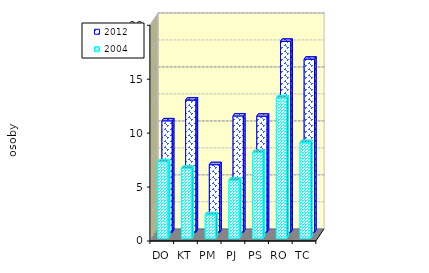
| Category | 2012 | 2004 |
|---|---|---|
| DO | 10.319 | 7.089 |
| KT | 12.243 | 6.489 |
| PM | 6.256 | 2.178 |
| PJ | 10.773 | 5.388 |
| PS | 10.747 | 7.948 |
| RO | 17.689 | 13.023 |
| TC | 16.033 | 8.87 |